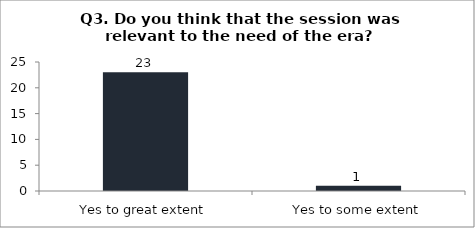
| Category | Q3. Do you think that the session was relevant to the need of the era? |
|---|---|
| Yes to great extent | 23 |
| Yes to some extent | 1 |